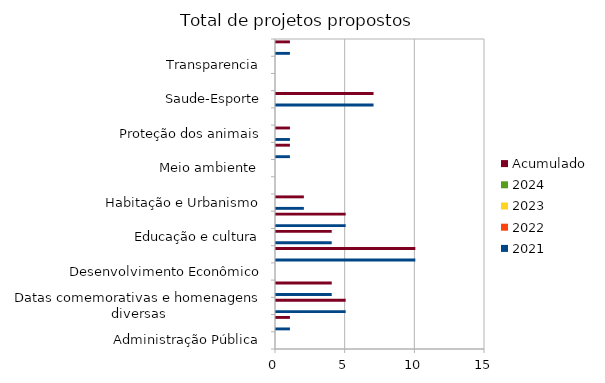
| Category | 2021 | 2022 | 2023 | 2024 | Acumulado |
|---|---|---|---|---|---|
| Administração Pública | 0 |  |  |  | 0 |
| Combate à corrupção  | 1 |  |  |  | 1 |
| Datas comemorativas e homenagens diversas | 5 |  |  |  | 5 |
| Denominação de logradouro | 4 |  |  |  | 4 |
| Desenvolvimento Econômico | 0 |  |  |  | 0 |
| Desenvolvimento Social  | 10 |  |  |  | 10 |
| Educação e cultura | 4 |  |  |  | 4 |
| Frente parlamentar | 5 |  |  |  | 5 |
| Habitação e Urbanismo | 2 |  |  |  | 2 |
| Lei Orgânica do Município | 0 |  |  |  | 0 |
| Meio ambiente  | 0 |  |  |  | 0 |
| Mobilidade | 1 |  |  |  | 1 |
| Proteção dos animais | 1 |  |  |  | 1 |
| Regimento Interno da CMSP | 0 |  |  |  | 0 |
| Saude-Esporte | 7 |  |  |  | 7 |
| Segurança Pública | 0 |  |  |  | 0 |
| Transparencia | 0 |  |  |  | 0 |
| Tributação | 1 |  |  |  | 1 |